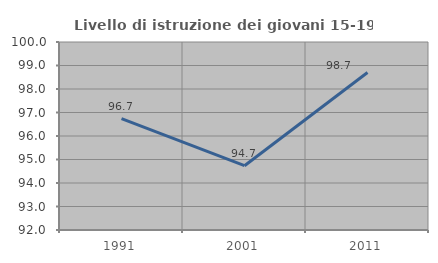
| Category | Livello di istruzione dei giovani 15-19 anni |
|---|---|
| 1991.0 | 96.739 |
| 2001.0 | 94.737 |
| 2011.0 | 98.701 |